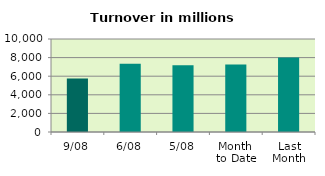
| Category | Series 0 |
|---|---|
| 9/08 | 5756.244 |
| 6/08 | 7326.279 |
| 5/08 | 7169.877 |
| Month 
to Date | 7247.685 |
| Last
Month | 8019.786 |